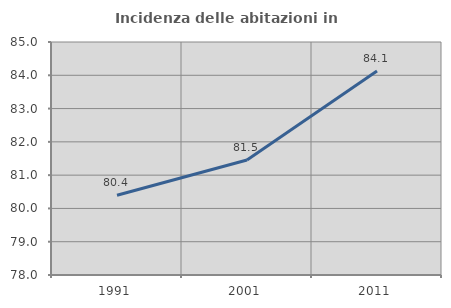
| Category | Incidenza delle abitazioni in proprietà  |
|---|---|
| 1991.0 | 80.397 |
| 2001.0 | 81.455 |
| 2011.0 | 84.126 |